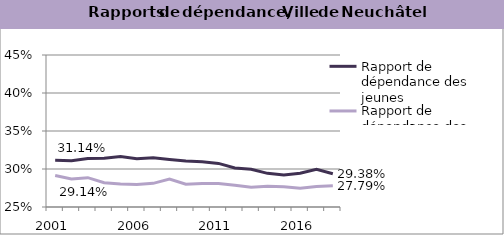
| Category | Rapport de dépendance des jeunes | Rapport de dépendance des personnes âgées |
|---|---|---|
| 2001.0 | 0.311 | 0.291 |
| 2002.0 | 0.311 | 0.287 |
| 2003.0 | 0.314 | 0.289 |
| 2004.0 | 0.314 | 0.282 |
| 2005.0 | 0.316 | 0.28 |
| 2006.0 | 0.314 | 0.28 |
| 2007.0 | 0.315 | 0.281 |
| 2008.0 | 0.313 | 0.287 |
| 2009.0 | 0.311 | 0.28 |
| 2010.0 | 0.31 | 0.281 |
| 2011.0 | 0.307 | 0.281 |
| 2012.0 | 0.301 | 0.279 |
| 2013.0 | 0.3 | 0.276 |
| 2014.0 | 0.294 | 0.277 |
| 2015.0 | 0.292 | 0.277 |
| 2016.0 | 0.294 | 0.275 |
| 2017.0 | 0.3 | 0.277 |
| 2018.0 | 0.294 | 0.278 |